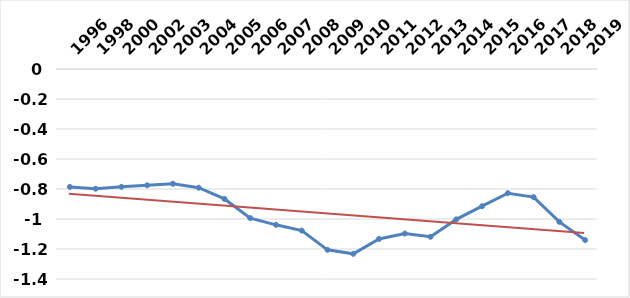
| Category | شاخص حکمرانی جهانی |
|---|---|
| 1996.0 | -0.786 |
| 1998.0 | -0.798 |
| 2000.0 | -0.786 |
| 2002.0 | -0.775 |
| 2003.0 | -0.765 |
| 2004.0 | -0.791 |
| 2005.0 | -0.866 |
| 2006.0 | -0.994 |
| 2007.0 | -1.039 |
| 2008.0 | -1.077 |
| 2009.0 | -1.206 |
| 2010.0 | -1.232 |
| 2011.0 | -1.133 |
| 2012.0 | -1.097 |
| 2013.0 | -1.119 |
| 2014.0 | -1.003 |
| 2015.0 | -0.915 |
| 2016.0 | -0.828 |
| 2017.0 | -0.854 |
| 2018.0 | -1.019 |
| 2019.0 | -1.14 |